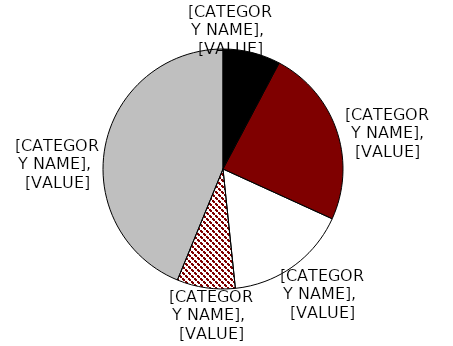
| Category | Series 0 |
|---|---|
| Protective services | 0.078 |
| K-12 teacher | 0.241 |
| School district employee | 0.165 |
| University faculty | 0.078 |
| General employee | 0.438 |